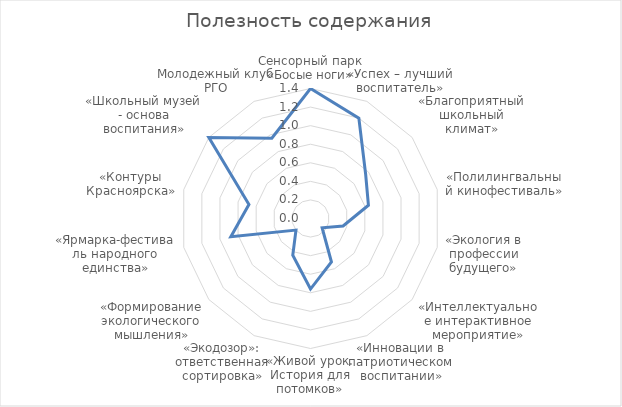
| Category | Series 0 |
|---|---|
| Сенсорный парк «Босые ноги» | 1.4 |
| «Успех – лучший воспитатель» | 1.2 |
| «Благоприятный школьный климат» | 0.76 |
| «Полилингвальный кинофестиваль» | 0.64 |
| «Экология в профессии будущего» | 0.36 |
| «Интеллектуальное интерактивное мероприятие» | 0.16 |
| «Инновации в патриотическом воспитании» | 0.52 |
| «Живой урок. История для потомков» | 0.76 |
| «Экодозор»: ответственная сортировка» | 0.44 |
| «Формирование экологического мышления» | 0.2 |
| «Ярмарка-фестиваль народного единства» | 0.88 |
| «Контуры Красноярска» | 0.68 |
| «Школьный музей - основа воспитания» | 1.4 |
| Молодежный клуб РГО | 0.96 |